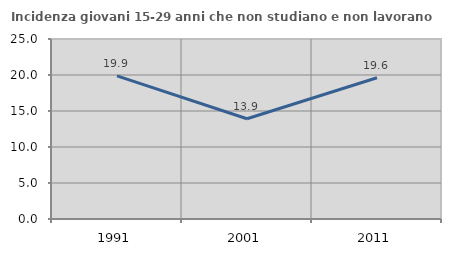
| Category | Incidenza giovani 15-29 anni che non studiano e non lavorano  |
|---|---|
| 1991.0 | 19.869 |
| 2001.0 | 13.928 |
| 2011.0 | 19.624 |